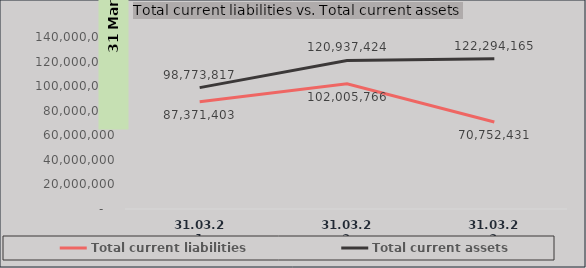
| Category | Total current liabilities | Total current assets |
|---|---|---|
| 31.03.21 | 87371403 | 98773817 |
| 31.03.22 | 102005765.86 | 120937424.48 |
| 31.03.23 | 70752430.847 | 122294165 |